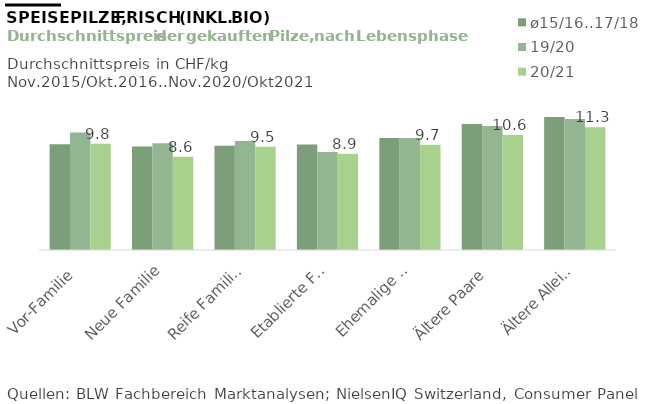
| Category | ø15/16..17/18 | 19/20 | 20/21 |
|---|---|---|---|
| Vor-Familie | 9.748 | 10.828 | 9.784 |
| Neue Familie | 9.532 | 9.824 | 8.587 |
| Reife Familien | 9.609 | 10.051 | 9.503 |
| Etablierte Familie | 9.721 | 9.029 | 8.871 |
| Ehemalige Familie | 10.31 | 10.315 | 9.697 |
| Ältere Paare | 11.598 | 11.424 | 10.594 |
| Ältere Alleinstehende | 12.26 | 12.061 | 11.309 |